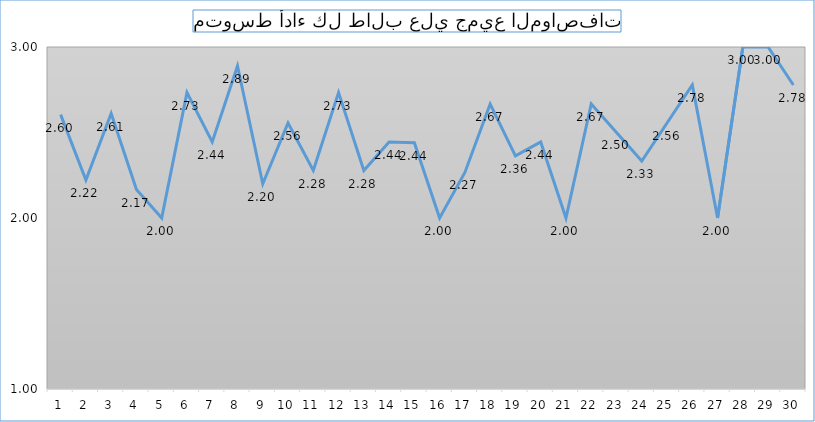
| Category | Series 0 |
|---|---|
| 0 | 2.605 |
| 1 | 2.222 |
| 2 | 2.611 |
| 3 | 2.167 |
| 4 | 2 |
| 5 | 2.733 |
| 6 | 2.444 |
| 7 | 2.889 |
| 8 | 2.2 |
| 9 | 2.556 |
| 10 | 2.278 |
| 11 | 2.733 |
| 12 | 2.278 |
| 13 | 2.444 |
| 14 | 2.44 |
| 15 | 2 |
| 16 | 2.267 |
| 17 | 2.667 |
| 18 | 2.364 |
| 19 | 2.444 |
| 20 | 2 |
| 21 | 2.667 |
| 22 | 2.501 |
| 23 | 2.333 |
| 24 | 2.556 |
| 25 | 2.778 |
| 26 | 2 |
| 27 | 3 |
| 28 | 3 |
| 29 | 2.778 |